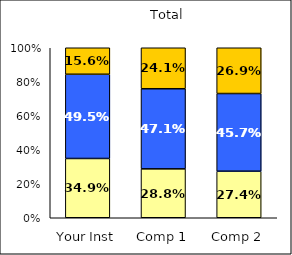
| Category | Low Institutional Priority: Commitment to Diversity | Average Institutional Priority: Commitment to Diversity | High Institutional Priority: Commitment to Diversity |
|---|---|---|---|
| Your Inst | 0.349 | 0.495 | 0.156 |
| Comp 1 | 0.288 | 0.471 | 0.241 |
| Comp 2 | 0.274 | 0.457 | 0.269 |